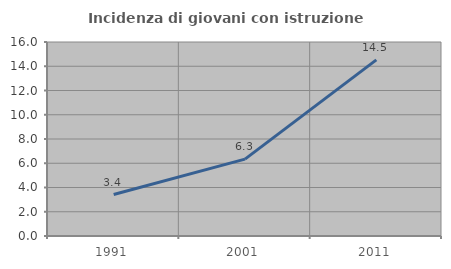
| Category | Incidenza di giovani con istruzione universitaria |
|---|---|
| 1991.0 | 3.421 |
| 2001.0 | 6.337 |
| 2011.0 | 14.524 |